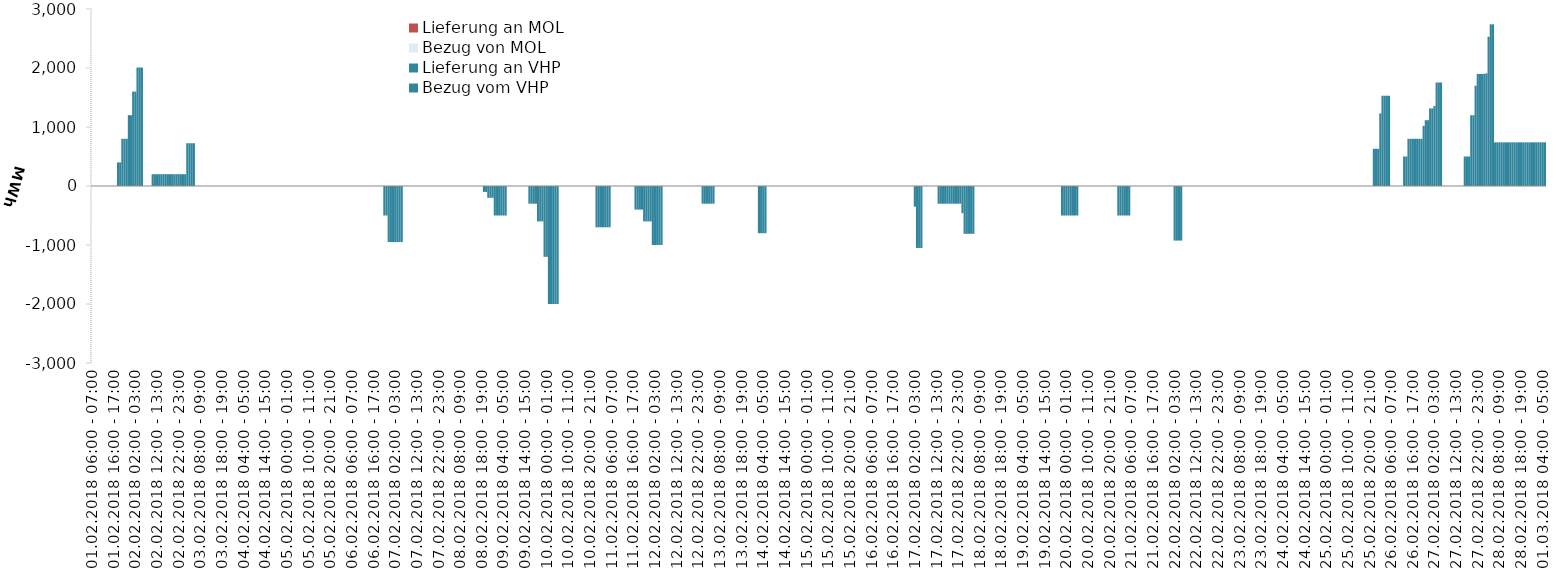
| Category | Bezug vom VHP | Lieferung an VHP | Bezug von MOL | Lieferung an MOL |
|---|---|---|---|---|
| 01.02.2018 06:00 - 07:00 | 0 | 0 | 0 | 0 |
| 01.02.2018 07:00 - 08:00 | 0 | 0 | 0 | 0 |
| 01.02.2018 08:00 - 09:00 | 0 | 0 | 0 | 0 |
| 01.02.2018 09:00 - 10:00 | 0 | 0 | 0 | 0 |
| 01.02.2018 10:00 - 11:00 | 0 | 0 | 0 | 0 |
| 01.02.2018 11:00 - 12:00 | 0 | 0 | 0 | 0 |
| 01.02.2018 12:00 - 13:00 | 0 | 0 | 0 | 0 |
| 01.02.2018 13:00 - 14:00 | 0 | 0 | 0 | 0 |
| 01.02.2018 14:00 - 15:00 | 0 | 0 | 0 | 0 |
| 01.02.2018 15:00 - 16:00 | 0 | 0 | 0 | 0 |
| 01.02.2018 16:00 - 17:00 | 0 | 0 | 0 | 0 |
| 01.02.2018 17:00 - 18:00 | 0 | 0 | 0 | 0 |
| 01.02.2018 18:00 - 19:00 | 400 | 0 | 0 | 0 |
| 01.02.2018 19:00 - 20:00 | 400 | 0 | 0 | 0 |
| 01.02.2018 20:00 - 21:00 | 800 | 0 | 0 | 0 |
| 01.02.2018 21:00 - 22:00 | 800 | 0 | 0 | 0 |
| 01.02.2018 22:00 - 23:00 | 800 | 0 | 0 | 0 |
| 01.02.2018 23:00 - 24:00 | 1200 | 0 | 0 | 0 |
| 02.02.2018 00:00 - 01:00 | 1200 | 0 | 0 | 0 |
| 02.02.2018 01:00 - 02:00 | 1600 | 0 | 0 | 0 |
| 02.02.2018 02:00 - 03:00 | 1600 | 0 | 0 | 0 |
| 02.02.2018 03:00 - 04:00 | 2008 | 0 | 0 | 0 |
| 02.02.2018 04:00 - 05:00 | 2008 | 0 | 0 | 0 |
| 02.02.2018 05:00 - 06:00 | 2008 | 0 | 0 | 0 |
| 02.02.2018 06:00 - 07:00 | 0 | 0 | 0 | 0 |
| 02.02.2018 07:00 - 08:00 | 0 | 0 | 0 | 0 |
| 02.02.2018 08:00 - 09:00 | 0 | 0 | 0 | 0 |
| 02.02.2018 09:00 - 10:00 | 0 | 0 | 0 | 0 |
| 02.02.2018 10:00 - 11:00 | 200 | 0 | 0 | 0 |
| 02.02.2018 11:00 - 12:00 | 200 | 0 | 0 | 0 |
| 02.02.2018 12:00 - 13:00 | 200 | 0 | 0 | 0 |
| 02.02.2018 13:00 - 14:00 | 200 | 0 | 0 | 0 |
| 02.02.2018 14:00 - 15:00 | 200 | 0 | 0 | 0 |
| 02.02.2018 15:00 - 16:00 | 200 | 0 | 0 | 0 |
| 02.02.2018 16:00 - 17:00 | 200 | 0 | 0 | 0 |
| 02.02.2018 17:00 - 18:00 | 200 | 0 | 0 | 0 |
| 02.02.2018 18:00 - 19:00 | 200 | 0 | 0 | 0 |
| 02.02.2018 19:00 - 20:00 | 200 | 0 | 0 | 0 |
| 02.02.2018 20:00 - 21:00 | 200 | 0 | 0 | 0 |
| 02.02.2018 21:00 - 22:00 | 200 | 0 | 0 | 0 |
| 02.02.2018 22:00 - 23:00 | 200 | 0 | 0 | 0 |
| 02.02.2018 23:00 - 24:00 | 200 | 0 | 0 | 0 |
| 03.02.2018 00:00 - 01:00 | 200 | 0 | 0 | 0 |
| 03.02.2018 01:00 - 02:00 | 200 | 0 | 0 | 0 |
| 03.02.2018 02:00 - 03:00 | 725 | 0 | 0 | 0 |
| 03.02.2018 03:00 - 04:00 | 725 | 0 | 0 | 0 |
| 03.02.2018 04:00 - 05:00 | 725 | 0 | 0 | 0 |
| 03.02.2018 05:00 - 06:00 | 725 | 0 | 0 | 0 |
| 03.02.2018 06:00 - 07:00 | 0 | 0 | 0 | 0 |
| 03.02.2018 07:00 - 08:00 | 0 | 0 | 0 | 0 |
| 03.02.2018 08:00 - 09:00 | 0 | 0 | 0 | 0 |
| 03.02.2018 09:00 - 10:00 | 0 | 0 | 0 | 0 |
| 03.02.2018 10:00 - 11:00 | 0 | 0 | 0 | 0 |
| 03.02.2018 11:00 - 12:00 | 0 | 0 | 0 | 0 |
| 03.02.2018 12:00 - 13:00 | 0 | 0 | 0 | 0 |
| 03.02.2018 13:00 - 14:00 | 0 | 0 | 0 | 0 |
| 03.02.2018 14:00 - 15:00 | 0 | 0 | 0 | 0 |
| 03.02.2018 15:00 - 16:00 | 0 | 0 | 0 | 0 |
| 03.02.2018 16:00 - 17:00 | 0 | 0 | 0 | 0 |
| 03.02.2018 17:00 - 18:00 | 0 | 0 | 0 | 0 |
| 03.02.2018 18:00 - 19:00 | 0 | 0 | 0 | 0 |
| 03.02.2018 19:00 - 20:00 | 0 | 0 | 0 | 0 |
| 03.02.2018 20:00 - 21:00 | 0 | 0 | 0 | 0 |
| 03.02.2018 21:00 - 22:00 | 0 | 0 | 0 | 0 |
| 03.02.2018 22:00 - 23:00 | 0 | 0 | 0 | 0 |
| 03.02.2018 23:00 - 24:00 | 0 | 0 | 0 | 0 |
| 04.02.2018 00:00 - 01:00 | 0 | 0 | 0 | 0 |
| 04.02.2018 01:00 - 02:00 | 0 | 0 | 0 | 0 |
| 04.02.2018 02:00 - 03:00 | 0 | 0 | 0 | 0 |
| 04.02.2018 03:00 - 04:00 | 0 | 0 | 0 | 0 |
| 04.02.2018 04:00 - 05:00 | 0 | 0 | 0 | 0 |
| 04.02.2018 05:00 - 06:00 | 0 | 0 | 0 | 0 |
| 04.02.2018 06:00 - 07:00 | 0 | 0 | 0 | 0 |
| 04.02.2018 07:00 - 08:00 | 0 | 0 | 0 | 0 |
| 04.02.2018 08:00 - 09:00 | 0 | 0 | 0 | 0 |
| 04.02.2018 09:00 - 10:00 | 0 | 0 | 0 | 0 |
| 04.02.2018 10:00 - 11:00 | 0 | 0 | 0 | 0 |
| 04.02.2018 11:00 - 12:00 | 0 | 0 | 0 | 0 |
| 04.02.2018 12:00 - 13:00 | 0 | 0 | 0 | 0 |
| 04.02.2018 13:00 - 14:00 | 0 | 0 | 0 | 0 |
| 04.02.2018 14:00 - 15:00 | 0 | 0 | 0 | 0 |
| 04.02.2018 15:00 - 16:00 | 0 | 0 | 0 | 0 |
| 04.02.2018 16:00 - 17:00 | 0 | 0 | 0 | 0 |
| 04.02.2018 17:00 - 18:00 | 0 | 0 | 0 | 0 |
| 04.02.2018 18:00 - 19:00 | 0 | 0 | 0 | 0 |
| 04.02.2018 19:00 - 20:00 | 0 | 0 | 0 | 0 |
| 04.02.2018 20:00 - 21:00 | 0 | 0 | 0 | 0 |
| 04.02.2018 21:00 - 22:00 | 0 | 0 | 0 | 0 |
| 04.02.2018 22:00 - 23:00 | 0 | 0 | 0 | 0 |
| 04.02.2018 23:00 - 24:00 | 0 | 0 | 0 | 0 |
| 05.02.2018 00:00 - 01:00 | 0 | 0 | 0 | 0 |
| 05.02.2018 01:00 - 02:00 | 0 | 0 | 0 | 0 |
| 05.02.2018 02:00 - 03:00 | 0 | 0 | 0 | 0 |
| 05.02.2018 03:00 - 04:00 | 0 | 0 | 0 | 0 |
| 05.02.2018 04:00 - 05:00 | 0 | 0 | 0 | 0 |
| 05.02.2018 05:00 - 06:00 | 0 | 0 | 0 | 0 |
| 05.02.2018 06:00 - 07:00 | 0 | 0 | 0 | 0 |
| 05.02.2018 07:00 - 08:00 | 0 | 0 | 0 | 0 |
| 05.02.2018 08:00 - 09:00 | 0 | 0 | 0 | 0 |
| 05.02.2018 09:00 - 10:00 | 0 | 0 | 0 | 0 |
| 05.02.2018 10:00 - 11:00 | 0 | 0 | 0 | 0 |
| 05.02.2018 11:00 - 12:00 | 0 | 0 | 0 | 0 |
| 05.02.2018 12:00 - 13:00 | 0 | 0 | 0 | 0 |
| 05.02.2018 13:00 - 14:00 | 0 | 0 | 0 | 0 |
| 05.02.2018 14:00 - 15:00 | 0 | 0 | 0 | 0 |
| 05.02.2018 15:00 - 16:00 | 0 | 0 | 0 | 0 |
| 05.02.2018 16:00 - 17:00 | 0 | 0 | 0 | 0 |
| 05.02.2018 17:00 - 18:00 | 0 | 0 | 0 | 0 |
| 05.02.2018 18:00 - 19:00 | 0 | 0 | 0 | 0 |
| 05.02.2018 19:00 - 20:00 | 0 | 0 | 0 | 0 |
| 05.02.2018 20:00 - 21:00 | 0 | 0 | 0 | 0 |
| 05.02.2018 21:00 - 22:00 | 0 | 0 | 0 | 0 |
| 05.02.2018 22:00 - 23:00 | 0 | 0 | 0 | 0 |
| 05.02.2018 23:00 - 24:00 | 0 | 0 | 0 | 0 |
| 06.02.2018 00:00 - 01:00 | 0 | 0 | 0 | 0 |
| 06.02.2018 01:00 - 02:00 | 0 | 0 | 0 | 0 |
| 06.02.2018 02:00 - 03:00 | 0 | 0 | 0 | 0 |
| 06.02.2018 03:00 - 04:00 | 0 | 0 | 0 | 0 |
| 06.02.2018 04:00 - 05:00 | 0 | 0 | 0 | 0 |
| 06.02.2018 05:00 - 06:00 | 0 | 0 | 0 | 0 |
| 06.02.2018 06:00 - 07:00 | 0 | 0 | 0 | 0 |
| 06.02.2018 07:00 - 08:00 | 0 | 0 | 0 | 0 |
| 06.02.2018 08:00 - 09:00 | 0 | 0 | 0 | 0 |
| 06.02.2018 09:00 - 10:00 | 0 | 0 | 0 | 0 |
| 06.02.2018 10:00 - 11:00 | 0 | 0 | 0 | 0 |
| 06.02.2018 11:00 - 12:00 | 0 | 0 | 0 | 0 |
| 06.02.2018 12:00 - 13:00 | 0 | 0 | 0 | 0 |
| 06.02.2018 13:00 - 14:00 | 0 | 0 | 0 | 0 |
| 06.02.2018 14:00 - 15:00 | 0 | 0 | 0 | 0 |
| 06.02.2018 15:00 - 16:00 | 0 | 0 | 0 | 0 |
| 06.02.2018 16:00 - 17:00 | 0 | 0 | 0 | 0 |
| 06.02.2018 17:00 - 18:00 | 0 | 0 | 0 | 0 |
| 06.02.2018 18:00 - 19:00 | 0 | 0 | 0 | 0 |
| 06.02.2018 19:00 - 20:00 | 0 | 0 | 0 | 0 |
| 06.02.2018 20:00 - 21:00 | 0 | 0 | 0 | 0 |
| 06.02.2018 21:00 - 22:00 | 0 | -500 | 0 | 0 |
| 06.02.2018 22:00 - 23:00 | 0 | -500 | 0 | 0 |
| 06.02.2018 23:00 - 24:00 | 0 | -950 | 0 | 0 |
| 07.02.2018 00:00 - 01:00 | 0 | -950 | 0 | 0 |
| 07.02.2018 01:00 - 02:00 | 0 | -950 | 0 | 0 |
| 07.02.2018 02:00 - 03:00 | 0 | -950 | 0 | 0 |
| 07.02.2018 03:00 - 04:00 | 0 | -950 | 0 | 0 |
| 07.02.2018 04:00 - 05:00 | 0 | -950 | 0 | 0 |
| 07.02.2018 05:00 - 06:00 | 0 | -950 | 0 | 0 |
| 07.02.2018 06:00 - 07:00 | 0 | 0 | 0 | 0 |
| 07.02.2018 07:00 - 08:00 | 0 | 0 | 0 | 0 |
| 07.02.2018 08:00 - 09:00 | 0 | 0 | 0 | 0 |
| 07.02.2018 09:00 - 10:00 | 0 | 0 | 0 | 0 |
| 07.02.2018 10:00 - 11:00 | 0 | 0 | 0 | 0 |
| 07.02.2018 11:00 - 12:00 | 0 | 0 | 0 | 0 |
| 07.02.2018 12:00 - 13:00 | 0 | 0 | 0 | 0 |
| 07.02.2018 13:00 - 14:00 | 0 | 0 | 0 | 0 |
| 07.02.2018 14:00 - 15:00 | 0 | 0 | 0 | 0 |
| 07.02.2018 15:00 - 16:00 | 0 | 0 | 0 | 0 |
| 07.02.2018 16:00 - 17:00 | 0 | 0 | 0 | 0 |
| 07.02.2018 17:00 - 18:00 | 0 | 0 | 0 | 0 |
| 07.02.2018 18:00 - 19:00 | 0 | 0 | 0 | 0 |
| 07.02.2018 19:00 - 20:00 | 0 | 0 | 0 | 0 |
| 07.02.2018 20:00 - 21:00 | 0 | 0 | 0 | 0 |
| 07.02.2018 21:00 - 22:00 | 0 | 0 | 0 | 0 |
| 07.02.2018 22:00 - 23:00 | 0 | 0 | 0 | 0 |
| 07.02.2018 23:00 - 24:00 | 0 | 0 | 0 | 0 |
| 08.02.2018 00:00 - 01:00 | 0 | 0 | 0 | 0 |
| 08.02.2018 01:00 - 02:00 | 0 | 0 | 0 | 0 |
| 08.02.2018 02:00 - 03:00 | 0 | 0 | 0 | 0 |
| 08.02.2018 03:00 - 04:00 | 0 | 0 | 0 | 0 |
| 08.02.2018 04:00 - 05:00 | 0 | 0 | 0 | 0 |
| 08.02.2018 05:00 - 06:00 | 0 | 0 | 0 | 0 |
| 08.02.2018 06:00 - 07:00 | 0 | 0 | 0 | 0 |
| 08.02.2018 07:00 - 08:00 | 0 | 0 | 0 | 0 |
| 08.02.2018 08:00 - 09:00 | 0 | 0 | 0 | 0 |
| 08.02.2018 09:00 - 10:00 | 0 | 0 | 0 | 0 |
| 08.02.2018 10:00 - 11:00 | 0 | 0 | 0 | 0 |
| 08.02.2018 11:00 - 12:00 | 0 | 0 | 0 | 0 |
| 08.02.2018 12:00 - 13:00 | 0 | 0 | 0 | 0 |
| 08.02.2018 13:00 - 14:00 | 0 | 0 | 0 | 0 |
| 08.02.2018 14:00 - 15:00 | 0 | 0 | 0 | 0 |
| 08.02.2018 15:00 - 16:00 | 0 | 0 | 0 | 0 |
| 08.02.2018 16:00 - 17:00 | 0 | 0 | 0 | 0 |
| 08.02.2018 17:00 - 18:00 | 0 | 0 | 0 | 0 |
| 08.02.2018 18:00 - 19:00 | 0 | 0 | 0 | 0 |
| 08.02.2018 19:00 - 20:00 | 0 | -100 | 0 | 0 |
| 08.02.2018 20:00 - 21:00 | 0 | -100 | 0 | 0 |
| 08.02.2018 21:00 - 22:00 | 0 | -200 | 0 | 0 |
| 08.02.2018 22:00 - 23:00 | 0 | -200 | 0 | 0 |
| 08.02.2018 23:00 - 24:00 | 0 | -200 | 0 | 0 |
| 09.02.2018 00:00 - 01:00 | 0 | -500 | 0 | 0 |
| 09.02.2018 01:00 - 02:00 | 0 | -500 | 0 | 0 |
| 09.02.2018 02:00 - 03:00 | 0 | -500 | 0 | 0 |
| 09.02.2018 03:00 - 04:00 | 0 | -500 | 0 | 0 |
| 09.02.2018 04:00 - 05:00 | 0 | -500 | 0 | 0 |
| 09.02.2018 05:00 - 06:00 | 0 | -500 | 0 | 0 |
| 09.02.2018 06:00 - 07:00 | 0 | 0 | 0 | 0 |
| 09.02.2018 07:00 - 08:00 | 0 | 0 | 0 | 0 |
| 09.02.2018 08:00 - 09:00 | 0 | 0 | 0 | 0 |
| 09.02.2018 09:00 - 10:00 | 0 | 0 | 0 | 0 |
| 09.02.2018 10:00 - 11:00 | 0 | 0 | 0 | 0 |
| 09.02.2018 11:00 - 12:00 | 0 | 0 | 0 | 0 |
| 09.02.2018 12:00 - 13:00 | 0 | 0 | 0 | 0 |
| 09.02.2018 13:00 - 14:00 | 0 | 0 | 0 | 0 |
| 09.02.2018 14:00 - 15:00 | 0 | 0 | 0 | 0 |
| 09.02.2018 15:00 - 16:00 | 0 | 0 | 0 | 0 |
| 09.02.2018 16:00 - 17:00 | 0 | -300 | 0 | 0 |
| 09.02.2018 17:00 - 18:00 | 0 | -300 | 0 | 0 |
| 09.02.2018 18:00 - 19:00 | 0 | -300 | 0 | 0 |
| 09.02.2018 19:00 - 20:00 | 0 | -300 | 0 | 0 |
| 09.02.2018 20:00 - 21:00 | 0 | -600 | 0 | 0 |
| 09.02.2018 21:00 - 22:00 | 0 | -600 | 0 | 0 |
| 09.02.2018 22:00 - 23:00 | 0 | -600 | 0 | 0 |
| 09.02.2018 23:00 - 24:00 | 0 | -1200 | 0 | 0 |
| 10.02.2018 00:00 - 01:00 | 0 | -1200 | 0 | 0 |
| 10.02.2018 01:00 - 02:00 | 0 | -2000 | 0 | 0 |
| 10.02.2018 02:00 - 03:00 | 0 | -2000 | 0 | 0 |
| 10.02.2018 03:00 - 04:00 | 0 | -2000 | 0 | 0 |
| 10.02.2018 04:00 - 05:00 | 0 | -2000 | 0 | 0 |
| 10.02.2018 05:00 - 06:00 | 0 | -2000 | 0 | 0 |
| 10.02.2018 06:00 - 07:00 | 0 | 0 | 0 | 0 |
| 10.02.2018 07:00 - 08:00 | 0 | 0 | 0 | 0 |
| 10.02.2018 08:00 - 09:00 | 0 | 0 | 0 | 0 |
| 10.02.2018 09:00 - 10:00 | 0 | 0 | 0 | 0 |
| 10.02.2018 10:00 - 11:00 | 0 | 0 | 0 | 0 |
| 10.02.2018 11:00 - 12:00 | 0 | 0 | 0 | 0 |
| 10.02.2018 12:00 - 13:00 | 0 | 0 | 0 | 0 |
| 10.02.2018 13:00 - 14:00 | 0 | 0 | 0 | 0 |
| 10.02.2018 14:00 - 15:00 | 0 | 0 | 0 | 0 |
| 10.02.2018 15:00 - 16:00 | 0 | 0 | 0 | 0 |
| 10.02.2018 16:00 - 17:00 | 0 | 0 | 0 | 0 |
| 10.02.2018 17:00 - 18:00 | 0 | 0 | 0 | 0 |
| 10.02.2018 18:00 - 19:00 | 0 | 0 | 0 | 0 |
| 10.02.2018 19:00 - 20:00 | 0 | 0 | 0 | 0 |
| 10.02.2018 20:00 - 21:00 | 0 | 0 | 0 | 0 |
| 10.02.2018 21:00 - 22:00 | 0 | 0 | 0 | 0 |
| 10.02.2018 22:00 - 23:00 | 0 | 0 | 0 | 0 |
| 10.02.2018 23:00 - 24:00 | 0 | -700 | 0 | 0 |
| 11.02.2018 00:00 - 01:00 | 0 | -700 | 0 | 0 |
| 11.02.2018 01:00 - 02:00 | 0 | -700 | 0 | 0 |
| 11.02.2018 02:00 - 03:00 | 0 | -700 | 0 | 0 |
| 11.02.2018 03:00 - 04:00 | 0 | -700 | 0 | 0 |
| 11.02.2018 04:00 - 05:00 | 0 | -700 | 0 | 0 |
| 11.02.2018 05:00 - 06:00 | 0 | -700 | 0 | 0 |
| 11.02.2018 06:00 - 07:00 | 0 | 0 | 0 | 0 |
| 11.02.2018 07:00 - 08:00 | 0 | 0 | 0 | 0 |
| 11.02.2018 08:00 - 09:00 | 0 | 0 | 0 | 0 |
| 11.02.2018 09:00 - 10:00 | 0 | 0 | 0 | 0 |
| 11.02.2018 10:00 - 11:00 | 0 | 0 | 0 | 0 |
| 11.02.2018 11:00 - 12:00 | 0 | 0 | 0 | 0 |
| 11.02.2018 12:00 - 13:00 | 0 | 0 | 0 | 0 |
| 11.02.2018 13:00 - 14:00 | 0 | 0 | 0 | 0 |
| 11.02.2018 14:00 - 15:00 | 0 | 0 | 0 | 0 |
| 11.02.2018 15:00 - 16:00 | 0 | 0 | 0 | 0 |
| 11.02.2018 16:00 - 17:00 | 0 | 0 | 0 | 0 |
| 11.02.2018 17:00 - 18:00 | 0 | -400 | 0 | 0 |
| 11.02.2018 18:00 - 19:00 | 0 | -400 | 0 | 0 |
| 11.02.2018 19:00 - 20:00 | 0 | -400 | 0 | 0 |
| 11.02.2018 20:00 - 21:00 | 0 | -400 | 0 | 0 |
| 11.02.2018 21:00 - 22:00 | 0 | -600 | 0 | 0 |
| 11.02.2018 22:00 - 23:00 | 0 | -600 | 0 | 0 |
| 11.02.2018 23:00 - 24:00 | 0 | -600 | 0 | 0 |
| 12.02.2018 00:00 - 01:00 | 0 | -600 | 0 | 0 |
| 12.02.2018 01:00 - 02:00 | 0 | -1000 | 0 | 0 |
| 12.02.2018 02:00 - 03:00 | 0 | -1000 | 0 | 0 |
| 12.02.2018 03:00 - 04:00 | 0 | -1000 | 0 | 0 |
| 12.02.2018 04:00 - 05:00 | 0 | -1000 | 0 | 0 |
| 12.02.2018 05:00 - 06:00 | 0 | -1000 | 0 | 0 |
| 12.02.2018 06:00 - 07:00 | 0 | 0 | 0 | 0 |
| 12.02.2018 07:00 - 08:00 | 0 | 0 | 0 | 0 |
| 12.02.2018 08:00 - 09:00 | 0 | 0 | 0 | 0 |
| 12.02.2018 09:00 - 10:00 | 0 | 0 | 0 | 0 |
| 12.02.2018 10:00 - 11:00 | 0 | 0 | 0 | 0 |
| 12.02.2018 11:00 - 12:00 | 0 | 0 | 0 | 0 |
| 12.02.2018 12:00 - 13:00 | 0 | 0 | 0 | 0 |
| 12.02.2018 13:00 - 14:00 | 0 | 0 | 0 | 0 |
| 12.02.2018 14:00 - 15:00 | 0 | 0 | 0 | 0 |
| 12.02.2018 15:00 - 16:00 | 0 | 0 | 0 | 0 |
| 12.02.2018 16:00 - 17:00 | 0 | 0 | 0 | 0 |
| 12.02.2018 17:00 - 18:00 | 0 | 0 | 0 | 0 |
| 12.02.2018 18:00 - 19:00 | 0 | 0 | 0 | 0 |
| 12.02.2018 19:00 - 20:00 | 0 | 0 | 0 | 0 |
| 12.02.2018 20:00 - 21:00 | 0 | 0 | 0 | 0 |
| 12.02.2018 21:00 - 22:00 | 0 | 0 | 0 | 0 |
| 12.02.2018 22:00 - 23:00 | 0 | 0 | 0 | 0 |
| 12.02.2018 23:00 - 24:00 | 0 | 0 | 0 | 0 |
| 13.02.2018 00:00 - 01:00 | 0 | -300 | 0 | 0 |
| 13.02.2018 01:00 - 02:00 | 0 | -300 | 0 | 0 |
| 13.02.2018 02:00 - 03:00 | 0 | -300 | 0 | 0 |
| 13.02.2018 03:00 - 04:00 | 0 | -300 | 0 | 0 |
| 13.02.2018 04:00 - 05:00 | 0 | -300 | 0 | 0 |
| 13.02.2018 05:00 - 06:00 | 0 | -300 | 0 | 0 |
| 13.02.2018 06:00 - 07:00 | 0 | 0 | 0 | 0 |
| 13.02.2018 07:00 - 08:00 | 0 | 0 | 0 | 0 |
| 13.02.2018 08:00 - 09:00 | 0 | 0 | 0 | 0 |
| 13.02.2018 09:00 - 10:00 | 0 | 0 | 0 | 0 |
| 13.02.2018 10:00 - 11:00 | 0 | 0 | 0 | 0 |
| 13.02.2018 11:00 - 12:00 | 0 | 0 | 0 | 0 |
| 13.02.2018 12:00 - 13:00 | 0 | 0 | 0 | 0 |
| 13.02.2018 13:00 - 14:00 | 0 | 0 | 0 | 0 |
| 13.02.2018 14:00 - 15:00 | 0 | 0 | 0 | 0 |
| 13.02.2018 15:00 - 16:00 | 0 | 0 | 0 | 0 |
| 13.02.2018 16:00 - 17:00 | 0 | 0 | 0 | 0 |
| 13.02.2018 17:00 - 18:00 | 0 | 0 | 0 | 0 |
| 13.02.2018 18:00 - 19:00 | 0 | 0 | 0 | 0 |
| 13.02.2018 19:00 - 20:00 | 0 | 0 | 0 | 0 |
| 13.02.2018 20:00 - 21:00 | 0 | 0 | 0 | 0 |
| 13.02.2018 21:00 - 22:00 | 0 | 0 | 0 | 0 |
| 13.02.2018 22:00 - 23:00 | 0 | 0 | 0 | 0 |
| 13.02.2018 23:00 - 24:00 | 0 | 0 | 0 | 0 |
| 14.02.2018 00:00 - 01:00 | 0 | 0 | 0 | 0 |
| 14.02.2018 01:00 - 02:00 | 0 | 0 | 0 | 0 |
| 14.02.2018 02:00 - 03:00 | 0 | -800 | 0 | 0 |
| 14.02.2018 03:00 - 04:00 | 0 | -800 | 0 | 0 |
| 14.02.2018 04:00 - 05:00 | 0 | -800 | 0 | 0 |
| 14.02.2018 05:00 - 06:00 | 0 | -800 | 0 | 0 |
| 14.02.2018 06:00 - 07:00 | 0 | 0 | 0 | 0 |
| 14.02.2018 07:00 - 08:00 | 0 | 0 | 0 | 0 |
| 14.02.2018 08:00 - 09:00 | 0 | 0 | 0 | 0 |
| 14.02.2018 09:00 - 10:00 | 0 | 0 | 0 | 0 |
| 14.02.2018 10:00 - 11:00 | 0 | 0 | 0 | 0 |
| 14.02.2018 11:00 - 12:00 | 0 | 0 | 0 | 0 |
| 14.02.2018 12:00 - 13:00 | 0 | 0 | 0 | 0 |
| 14.02.2018 13:00 - 14:00 | 0 | 0 | 0 | 0 |
| 14.02.2018 14:00 - 15:00 | 0 | 0 | 0 | 0 |
| 14.02.2018 15:00 - 16:00 | 0 | 0 | 0 | 0 |
| 14.02.2018 16:00 - 17:00 | 0 | 0 | 0 | 0 |
| 14.02.2018 17:00 - 18:00 | 0 | 0 | 0 | 0 |
| 14.02.2018 18:00 - 19:00 | 0 | 0 | 0 | 0 |
| 14.02.2018 19:00 - 20:00 | 0 | 0 | 0 | 0 |
| 14.02.2018 20:00 - 21:00 | 0 | 0 | 0 | 0 |
| 14.02.2018 21:00 - 22:00 | 0 | 0 | 0 | 0 |
| 14.02.2018 22:00 - 23:00 | 0 | 0 | 0 | 0 |
| 14.02.2018 23:00 - 24:00 | 0 | 0 | 0 | 0 |
| 15.02.2018 00:00 - 01:00 | 0 | 0 | 0 | 0 |
| 15.02.2018 01:00 - 02:00 | 0 | 0 | 0 | 0 |
| 15.02.2018 02:00 - 03:00 | 0 | 0 | 0 | 0 |
| 15.02.2018 03:00 - 04:00 | 0 | 0 | 0 | 0 |
| 15.02.2018 04:00 - 05:00 | 0 | 0 | 0 | 0 |
| 15.02.2018 05:00 - 06:00 | 0 | 0 | 0 | 0 |
| 15.02.2018 06:00 - 07:00 | 0 | 0 | 0 | 0 |
| 15.02.2018 07:00 - 08:00 | 0 | 0 | 0 | 0 |
| 15.02.2018 08:00 - 09:00 | 0 | 0 | 0 | 0 |
| 15.02.2018 09:00 - 10:00 | 0 | 0 | 0 | 0 |
| 15.02.2018 10:00 - 11:00 | 0 | 0 | 0 | 0 |
| 15.02.2018 11:00 - 12:00 | 0 | 0 | 0 | 0 |
| 15.02.2018 12:00 - 13:00 | 0 | 0 | 0 | 0 |
| 15.02.2018 13:00 - 14:00 | 0 | 0 | 0 | 0 |
| 15.02.2018 14:00 - 15:00 | 0 | 0 | 0 | 0 |
| 15.02.2018 15:00 - 16:00 | 0 | 0 | 0 | 0 |
| 15.02.2018 16:00 - 17:00 | 0 | 0 | 0 | 0 |
| 15.02.2018 17:00 - 18:00 | 0 | 0 | 0 | 0 |
| 15.02.2018 18:00 - 19:00 | 0 | 0 | 0 | 0 |
| 15.02.2018 19:00 - 20:00 | 0 | 0 | 0 | 0 |
| 15.02.2018 20:00 - 21:00 | 0 | 0 | 0 | 0 |
| 15.02.2018 21:00 - 22:00 | 0 | 0 | 0 | 0 |
| 15.02.2018 22:00 - 23:00 | 0 | 0 | 0 | 0 |
| 15.02.2018 23:00 - 24:00 | 0 | 0 | 0 | 0 |
| 16.02.2018 00:00 - 01:00 | 0 | 0 | 0 | 0 |
| 16.02.2018 01:00 - 02:00 | 0 | 0 | 0 | 0 |
| 16.02.2018 02:00 - 03:00 | 0 | 0 | 0 | 0 |
| 16.02.2018 03:00 - 04:00 | 0 | 0 | 0 | 0 |
| 16.02.2018 04:00 - 05:00 | 0 | 0 | 0 | 0 |
| 16.02.2018 05:00 - 06:00 | 0 | 0 | 0 | 0 |
| 16.02.2018 06:00 - 07:00 | 0 | 0 | 0 | 0 |
| 16.02.2018 07:00 - 08:00 | 0 | 0 | 0 | 0 |
| 16.02.2018 08:00 - 09:00 | 0 | 0 | 0 | 0 |
| 16.02.2018 09:00 - 10:00 | 0 | 0 | 0 | 0 |
| 16.02.2018 10:00 - 11:00 | 0 | 0 | 0 | 0 |
| 16.02.2018 11:00 - 12:00 | 0 | 0 | 0 | 0 |
| 16.02.2018 12:00 - 13:00 | 0 | 0 | 0 | 0 |
| 16.02.2018 13:00 - 14:00 | 0 | 0 | 0 | 0 |
| 16.02.2018 14:00 - 15:00 | 0 | 0 | 0 | 0 |
| 16.02.2018 15:00 - 16:00 | 0 | 0 | 0 | 0 |
| 16.02.2018 16:00 - 17:00 | 0 | 0 | 0 | 0 |
| 16.02.2018 17:00 - 18:00 | 0 | 0 | 0 | 0 |
| 16.02.2018 18:00 - 19:00 | 0 | 0 | 0 | 0 |
| 16.02.2018 19:00 - 20:00 | 0 | 0 | 0 | 0 |
| 16.02.2018 20:00 - 21:00 | 0 | 0 | 0 | 0 |
| 16.02.2018 21:00 - 22:00 | 0 | 0 | 0 | 0 |
| 16.02.2018 22:00 - 23:00 | 0 | 0 | 0 | 0 |
| 16.02.2018 23:00 - 24:00 | 0 | 0 | 0 | 0 |
| 17.02.2018 00:00 - 01:00 | 0 | 0 | 0 | 0 |
| 17.02.2018 01:00 - 02:00 | 0 | 0 | 0 | 0 |
| 17.02.2018 02:00 - 03:00 | 0 | -350 | 0 | 0 |
| 17.02.2018 03:00 - 04:00 | 0 | -1050 | 0 | 0 |
| 17.02.2018 04:00 - 05:00 | 0 | -1050 | 0 | 0 |
| 17.02.2018 05:00 - 06:00 | 0 | -1050 | 0 | 0 |
| 17.02.2018 06:00 - 07:00 | 0 | 0 | 0 | 0 |
| 17.02.2018 07:00 - 08:00 | 0 | 0 | 0 | 0 |
| 17.02.2018 08:00 - 09:00 | 0 | 0 | 0 | 0 |
| 17.02.2018 09:00 - 10:00 | 0 | 0 | 0 | 0 |
| 17.02.2018 10:00 - 11:00 | 0 | 0 | 0 | 0 |
| 17.02.2018 11:00 - 12:00 | 0 | 0 | 0 | 0 |
| 17.02.2018 12:00 - 13:00 | 0 | 0 | 0 | 0 |
| 17.02.2018 13:00 - 14:00 | 0 | -300 | 0 | 0 |
| 17.02.2018 14:00 - 15:00 | 0 | -300 | 0 | 0 |
| 17.02.2018 15:00 - 16:00 | 0 | -300 | 0 | 0 |
| 17.02.2018 16:00 - 17:00 | 0 | -300 | 0 | 0 |
| 17.02.2018 17:00 - 18:00 | 0 | -300 | 0 | 0 |
| 17.02.2018 18:00 - 19:00 | 0 | -300 | 0 | 0 |
| 17.02.2018 19:00 - 20:00 | 0 | -300 | 0 | 0 |
| 17.02.2018 20:00 - 21:00 | 0 | -300 | 0 | 0 |
| 17.02.2018 21:00 - 22:00 | 0 | -300 | 0 | 0 |
| 17.02.2018 22:00 - 23:00 | 0 | -300 | 0 | 0 |
| 17.02.2018 23:00 - 24:00 | 0 | -300 | 0 | 0 |
| 18.02.2018 00:00 - 01:00 | 0 | -460 | 0 | 0 |
| 18.02.2018 01:00 - 02:00 | 0 | -810 | 0 | 0 |
| 18.02.2018 02:00 - 03:00 | 0 | -810 | 0 | 0 |
| 18.02.2018 03:00 - 04:00 | 0 | -810 | 0 | 0 |
| 18.02.2018 04:00 - 05:00 | 0 | -810 | 0 | 0 |
| 18.02.2018 05:00 - 06:00 | 0 | -810 | 0 | 0 |
| 18.02.2018 06:00 - 07:00 | 0 | 0 | 0 | 0 |
| 18.02.2018 07:00 - 08:00 | 0 | 0 | 0 | 0 |
| 18.02.2018 08:00 - 09:00 | 0 | 0 | 0 | 0 |
| 18.02.2018 09:00 - 10:00 | 0 | 0 | 0 | 0 |
| 18.02.2018 10:00 - 11:00 | 0 | 0 | 0 | 0 |
| 18.02.2018 11:00 - 12:00 | 0 | 0 | 0 | 0 |
| 18.02.2018 12:00 - 13:00 | 0 | 0 | 0 | 0 |
| 18.02.2018 13:00 - 14:00 | 0 | 0 | 0 | 0 |
| 18.02.2018 14:00 - 15:00 | 0 | 0 | 0 | 0 |
| 18.02.2018 15:00 - 16:00 | 0 | 0 | 0 | 0 |
| 18.02.2018 16:00 - 17:00 | 0 | 0 | 0 | 0 |
| 18.02.2018 17:00 - 18:00 | 0 | 0 | 0 | 0 |
| 18.02.2018 18:00 - 19:00 | 0 | 0 | 0 | 0 |
| 18.02.2018 19:00 - 20:00 | 0 | 0 | 0 | 0 |
| 18.02.2018 20:00 - 21:00 | 0 | 0 | 0 | 0 |
| 18.02.2018 21:00 - 22:00 | 0 | 0 | 0 | 0 |
| 18.02.2018 22:00 - 23:00 | 0 | 0 | 0 | 0 |
| 18.02.2018 23:00 - 24:00 | 0 | 0 | 0 | 0 |
| 19.02.2018 00:00 - 01:00 | 0 | 0 | 0 | 0 |
| 19.02.2018 01:00 - 02:00 | 0 | 0 | 0 | 0 |
| 19.02.2018 02:00 - 03:00 | 0 | 0 | 0 | 0 |
| 19.02.2018 03:00 - 04:00 | 0 | 0 | 0 | 0 |
| 19.02.2018 04:00 - 05:00 | 0 | 0 | 0 | 0 |
| 19.02.2018 05:00 - 06:00 | 0 | 0 | 0 | 0 |
| 19.02.2018 06:00 - 07:00 | 0 | 0 | 0 | 0 |
| 19.02.2018 07:00 - 08:00 | 0 | 0 | 0 | 0 |
| 19.02.2018 08:00 - 09:00 | 0 | 0 | 0 | 0 |
| 19.02.2018 09:00 - 10:00 | 0 | 0 | 0 | 0 |
| 19.02.2018 10:00 - 11:00 | 0 | 0 | 0 | 0 |
| 19.02.2018 11:00 - 12:00 | 0 | 0 | 0 | 0 |
| 19.02.2018 12:00 - 13:00 | 0 | 0 | 0 | 0 |
| 19.02.2018 13:00 - 14:00 | 0 | 0 | 0 | 0 |
| 19.02.2018 14:00 - 15:00 | 0 | 0 | 0 | 0 |
| 19.02.2018 15:00 - 16:00 | 0 | 0 | 0 | 0 |
| 19.02.2018 16:00 - 17:00 | 0 | 0 | 0 | 0 |
| 19.02.2018 17:00 - 18:00 | 0 | 0 | 0 | 0 |
| 19.02.2018 18:00 - 19:00 | 0 | 0 | 0 | 0 |
| 19.02.2018 19:00 - 20:00 | 0 | 0 | 0 | 0 |
| 19.02.2018 20:00 - 21:00 | 0 | 0 | 0 | 0 |
| 19.02.2018 21:00 - 22:00 | 0 | 0 | 0 | 0 |
| 19.02.2018 22:00 - 23:00 | 0 | -500 | 0 | 0 |
| 19.02.2018 23:00 - 24:00 | 0 | -500 | 0 | 0 |
| 20.02.2018 00:00 - 01:00 | 0 | -500 | 0 | 0 |
| 20.02.2018 01:00 - 02:00 | 0 | -500 | 0 | 0 |
| 20.02.2018 02:00 - 03:00 | 0 | -500 | 0 | 0 |
| 20.02.2018 03:00 - 04:00 | 0 | -500 | 0 | 0 |
| 20.02.2018 04:00 - 05:00 | 0 | -500 | 0 | 0 |
| 20.02.2018 05:00 - 06:00 | 0 | -500 | 0 | 0 |
| 20.02.2018 06:00 - 07:00 | 0 | 0 | 0 | 0 |
| 20.02.2018 07:00 - 08:00 | 0 | 0 | 0 | 0 |
| 20.02.2018 08:00 - 09:00 | 0 | 0 | 0 | 0 |
| 20.02.2018 09:00 - 10:00 | 0 | 0 | 0 | 0 |
| 20.02.2018 10:00 - 11:00 | 0 | 0 | 0 | 0 |
| 20.02.2018 11:00 - 12:00 | 0 | 0 | 0 | 0 |
| 20.02.2018 12:00 - 13:00 | 0 | 0 | 0 | 0 |
| 20.02.2018 13:00 - 14:00 | 0 | 0 | 0 | 0 |
| 20.02.2018 14:00 - 15:00 | 0 | 0 | 0 | 0 |
| 20.02.2018 15:00 - 16:00 | 0 | 0 | 0 | 0 |
| 20.02.2018 16:00 - 17:00 | 0 | 0 | 0 | 0 |
| 20.02.2018 17:00 - 18:00 | 0 | 0 | 0 | 0 |
| 20.02.2018 18:00 - 19:00 | 0 | 0 | 0 | 0 |
| 20.02.2018 19:00 - 20:00 | 0 | 0 | 0 | 0 |
| 20.02.2018 20:00 - 21:00 | 0 | 0 | 0 | 0 |
| 20.02.2018 21:00 - 22:00 | 0 | 0 | 0 | 0 |
| 20.02.2018 22:00 - 23:00 | 0 | 0 | 0 | 0 |
| 20.02.2018 23:00 - 24:00 | 0 | 0 | 0 | 0 |
| 21.02.2018 00:00 - 01:00 | 0 | -500 | 0 | 0 |
| 21.02.2018 01:00 - 02:00 | 0 | -500 | 0 | 0 |
| 21.02.2018 02:00 - 03:00 | 0 | -500 | 0 | 0 |
| 21.02.2018 03:00 - 04:00 | 0 | -500 | 0 | 0 |
| 21.02.2018 04:00 - 05:00 | 0 | -500 | 0 | 0 |
| 21.02.2018 05:00 - 06:00 | 0 | -500 | 0 | 0 |
| 21.02.2018 06:00 - 07:00 | 0 | 0 | 0 | 0 |
| 21.02.2018 07:00 - 08:00 | 0 | 0 | 0 | 0 |
| 21.02.2018 08:00 - 09:00 | 0 | 0 | 0 | 0 |
| 21.02.2018 09:00 - 10:00 | 0 | 0 | 0 | 0 |
| 21.02.2018 10:00 - 11:00 | 0 | 0 | 0 | 0 |
| 21.02.2018 11:00 - 12:00 | 0 | 0 | 0 | 0 |
| 21.02.2018 12:00 - 13:00 | 0 | 0 | 0 | 0 |
| 21.02.2018 13:00 - 14:00 | 0 | 0 | 0 | 0 |
| 21.02.2018 14:00 - 15:00 | 0 | 0 | 0 | 0 |
| 21.02.2018 15:00 - 16:00 | 0 | 0 | 0 | 0 |
| 21.02.2018 16:00 - 17:00 | 0 | 0 | 0 | 0 |
| 21.02.2018 17:00 - 18:00 | 0 | 0 | 0 | 0 |
| 21.02.2018 18:00 - 19:00 | 0 | 0 | 0 | 0 |
| 21.02.2018 19:00 - 20:00 | 0 | 0 | 0 | 0 |
| 21.02.2018 20:00 - 21:00 | 0 | 0 | 0 | 0 |
| 21.02.2018 21:00 - 22:00 | 0 | 0 | 0 | 0 |
| 21.02.2018 22:00 - 23:00 | 0 | 0 | 0 | 0 |
| 21.02.2018 23:00 - 24:00 | 0 | 0 | 0 | 0 |
| 22.02.2018 00:00 - 01:00 | 0 | 0 | 0 | 0 |
| 22.02.2018 01:00 - 02:00 | 0 | 0 | 0 | 0 |
| 22.02.2018 02:00 - 03:00 | 0 | -925 | 0 | 0 |
| 22.02.2018 03:00 - 04:00 | 0 | -925 | 0 | 0 |
| 22.02.2018 04:00 - 05:00 | 0 | -925 | 0 | 0 |
| 22.02.2018 05:00 - 06:00 | 0 | -925 | 0 | 0 |
| 22.02.2018 06:00 - 07:00 | 0 | 0 | 0 | 0 |
| 22.02.2018 07:00 - 08:00 | 0 | 0 | 0 | 0 |
| 22.02.2018 08:00 - 09:00 | 0 | 0 | 0 | 0 |
| 22.02.2018 09:00 - 10:00 | 0 | 0 | 0 | 0 |
| 22.02.2018 10:00 - 11:00 | 0 | 0 | 0 | 0 |
| 22.02.2018 11:00 - 12:00 | 0 | 0 | 0 | 0 |
| 22.02.2018 12:00 - 13:00 | 0 | 0 | 0 | 0 |
| 22.02.2018 13:00 - 14:00 | 0 | 0 | 0 | 0 |
| 22.02.2018 14:00 - 15:00 | 0 | 0 | 0 | 0 |
| 22.02.2018 15:00 - 16:00 | 0 | 0 | 0 | 0 |
| 22.02.2018 16:00 - 17:00 | 0 | 0 | 0 | 0 |
| 22.02.2018 17:00 - 18:00 | 0 | 0 | 0 | 0 |
| 22.02.2018 18:00 - 19:00 | 0 | 0 | 0 | 0 |
| 22.02.2018 19:00 - 20:00 | 0 | 0 | 0 | 0 |
| 22.02.2018 20:00 - 21:00 | 0 | 0 | 0 | 0 |
| 22.02.2018 21:00 - 22:00 | 0 | 0 | 0 | 0 |
| 22.02.2018 22:00 - 23:00 | 0 | 0 | 0 | 0 |
| 22.02.2018 23:00 - 24:00 | 0 | 0 | 0 | 0 |
| 23.02.2018 00:00 - 01:00 | 0 | 0 | 0 | 0 |
| 23.02.2018 01:00 - 02:00 | 0 | 0 | 0 | 0 |
| 23.02.2018 02:00 - 03:00 | 0 | 0 | 0 | 0 |
| 23.02.2018 03:00 - 04:00 | 0 | 0 | 0 | 0 |
| 23.02.2018 04:00 - 05:00 | 0 | 0 | 0 | 0 |
| 23.02.2018 05:00 - 06:00 | 0 | 0 | 0 | 0 |
| 23.02.2018 06:00 - 07:00 | 0 | 0 | 0 | 0 |
| 23.02.2018 07:00 - 08:00 | 0 | 0 | 0 | 0 |
| 23.02.2018 08:00 - 09:00 | 0 | 0 | 0 | 0 |
| 23.02.2018 09:00 - 10:00 | 0 | 0 | 0 | 0 |
| 23.02.2018 10:00 - 11:00 | 0 | 0 | 0 | 0 |
| 23.02.2018 11:00 - 12:00 | 0 | 0 | 0 | 0 |
| 23.02.2018 12:00 - 13:00 | 0 | 0 | 0 | 0 |
| 23.02.2018 13:00 - 14:00 | 0 | 0 | 0 | 0 |
| 23.02.2018 14:00 - 15:00 | 0 | 0 | 0 | 0 |
| 23.02.2018 15:00 - 16:00 | 0 | 0 | 0 | 0 |
| 23.02.2018 16:00 - 17:00 | 0 | 0 | 0 | 0 |
| 23.02.2018 17:00 - 18:00 | 0 | 0 | 0 | 0 |
| 23.02.2018 18:00 - 19:00 | 0 | 0 | 0 | 0 |
| 23.02.2018 19:00 - 20:00 | 0 | 0 | 0 | 0 |
| 23.02.2018 20:00 - 21:00 | 0 | 0 | 0 | 0 |
| 23.02.2018 21:00 - 22:00 | 0 | 0 | 0 | 0 |
| 23.02.2018 22:00 - 23:00 | 0 | 0 | 0 | 0 |
| 23.02.2018 23:00 - 24:00 | 0 | 0 | 0 | 0 |
| 24.02.2018 00:00 - 01:00 | 0 | 0 | 0 | 0 |
| 24.02.2018 01:00 - 02:00 | 0 | 0 | 0 | 0 |
| 24.02.2018 02:00 - 03:00 | 0 | 0 | 0 | 0 |
| 24.02.2018 03:00 - 04:00 | 0 | 0 | 0 | 0 |
| 24.02.2018 04:00 - 05:00 | 0 | 0 | 0 | 0 |
| 24.02.2018 05:00 - 06:00 | 0 | 0 | 0 | 0 |
| 24.02.2018 06:00 - 07:00 | 0 | 0 | 0 | 0 |
| 24.02.2018 07:00 - 08:00 | 0 | 0 | 0 | 0 |
| 24.02.2018 08:00 - 09:00 | 0 | 0 | 0 | 0 |
| 24.02.2018 09:00 - 10:00 | 0 | 0 | 0 | 0 |
| 24.02.2018 10:00 - 11:00 | 0 | 0 | 0 | 0 |
| 24.02.2018 11:00 - 12:00 | 0 | 0 | 0 | 0 |
| 24.02.2018 12:00 - 13:00 | 0 | 0 | 0 | 0 |
| 24.02.2018 13:00 - 14:00 | 0 | 0 | 0 | 0 |
| 24.02.2018 14:00 - 15:00 | 0 | 0 | 0 | 0 |
| 24.02.2018 15:00 - 16:00 | 0 | 0 | 0 | 0 |
| 24.02.2018 16:00 - 17:00 | 0 | 0 | 0 | 0 |
| 24.02.2018 17:00 - 18:00 | 0 | 0 | 0 | 0 |
| 24.02.2018 18:00 - 19:00 | 0 | 0 | 0 | 0 |
| 24.02.2018 19:00 - 20:00 | 0 | 0 | 0 | 0 |
| 24.02.2018 20:00 - 21:00 | 0 | 0 | 0 | 0 |
| 24.02.2018 21:00 - 22:00 | 0 | 0 | 0 | 0 |
| 24.02.2018 22:00 - 23:00 | 0 | 0 | 0 | 0 |
| 24.02.2018 23:00 - 24:00 | 0 | 0 | 0 | 0 |
| 25.02.2018 00:00 - 01:00 | 0 | 0 | 0 | 0 |
| 25.02.2018 01:00 - 02:00 | 0 | 0 | 0 | 0 |
| 25.02.2018 02:00 - 03:00 | 0 | 0 | 0 | 0 |
| 25.02.2018 03:00 - 04:00 | 0 | 0 | 0 | 0 |
| 25.02.2018 04:00 - 05:00 | 0 | 0 | 0 | 0 |
| 25.02.2018 05:00 - 06:00 | 0 | 0 | 0 | 0 |
| 25.02.2018 06:00 - 07:00 | 0 | 0 | 0 | 0 |
| 25.02.2018 07:00 - 08:00 | 0 | 0 | 0 | 0 |
| 25.02.2018 08:00 - 09:00 | 0 | 0 | 0 | 0 |
| 25.02.2018 09:00 - 10:00 | 0 | 0 | 0 | 0 |
| 25.02.2018 10:00 - 11:00 | 0 | 0 | 0 | 0 |
| 25.02.2018 11:00 - 12:00 | 0 | 0 | 0 | 0 |
| 25.02.2018 12:00 - 13:00 | 0 | 0 | 0 | 0 |
| 25.02.2018 13:00 - 14:00 | 0 | 0 | 0 | 0 |
| 25.02.2018 14:00 - 15:00 | 0 | 0 | 0 | 0 |
| 25.02.2018 15:00 - 16:00 | 0 | 0 | 0 | 0 |
| 25.02.2018 16:00 - 17:00 | 0 | 0 | 0 | 0 |
| 25.02.2018 17:00 - 18:00 | 0 | 0 | 0 | 0 |
| 25.02.2018 18:00 - 19:00 | 0 | 0 | 0 | 0 |
| 25.02.2018 19:00 - 20:00 | 0 | 0 | 0 | 0 |
| 25.02.2018 20:00 - 21:00 | 0 | 0 | 0 | 0 |
| 25.02.2018 21:00 - 22:00 | 0 | 0 | 0 | 0 |
| 25.02.2018 22:00 - 23:00 | 630 | 0 | 0 | 0 |
| 25.02.2018 23:00 - 24:00 | 630 | 0 | 0 | 0 |
| 26.02.2018 00:00 - 01:00 | 630 | 0 | 0 | 0 |
| 26.02.2018 01:00 - 02:00 | 1230 | 0 | 0 | 0 |
| 26.02.2018 02:00 - 03:00 | 1530 | 0 | 0 | 0 |
| 26.02.2018 03:00 - 04:00 | 1530 | 0 | 0 | 0 |
| 26.02.2018 04:00 - 05:00 | 1530 | 0 | 0 | 0 |
| 26.02.2018 05:00 - 06:00 | 1530 | 0 | 0 | 0 |
| 26.02.2018 06:00 - 07:00 | 0 | 0 | 0 | 0 |
| 26.02.2018 07:00 - 08:00 | 0 | 0 | 0 | 0 |
| 26.02.2018 08:00 - 09:00 | 0 | 0 | 0 | 0 |
| 26.02.2018 09:00 - 10:00 | 0 | 0 | 0 | 0 |
| 26.02.2018 10:00 - 11:00 | 0 | 0 | 0 | 0 |
| 26.02.2018 11:00 - 12:00 | 0 | 0 | 0 | 0 |
| 26.02.2018 12:00 - 13:00 | 500 | 0 | 0 | 0 |
| 26.02.2018 13:00 - 14:00 | 500 | 0 | 0 | 0 |
| 26.02.2018 14:00 - 15:00 | 800 | 0 | 0 | 0 |
| 26.02.2018 15:00 - 16:00 | 800 | 0 | 0 | 0 |
| 26.02.2018 16:00 - 17:00 | 800 | 0 | 0 | 0 |
| 26.02.2018 17:00 - 18:00 | 800 | 0 | 0 | 0 |
| 26.02.2018 18:00 - 19:00 | 800 | 0 | 0 | 0 |
| 26.02.2018 19:00 - 20:00 | 800 | 0 | 0 | 0 |
| 26.02.2018 20:00 - 21:00 | 800 | 0 | 0 | 0 |
| 26.02.2018 21:00 - 22:00 | 1020 | 0 | 0 | 0 |
| 26.02.2018 22:00 - 23:00 | 1115 | 0 | 0 | 0 |
| 26.02.2018 23:00 - 24:00 | 1115 | 0 | 0 | 0 |
| 27.02.2018 00:00 - 01:00 | 1315 | 0 | 0 | 0 |
| 27.02.2018 01:00 - 02:00 | 1315 | 0 | 0 | 0 |
| 27.02.2018 02:00 - 03:00 | 1355 | 0 | 0 | 0 |
| 27.02.2018 03:00 - 04:00 | 1755 | 0 | 0 | 0 |
| 27.02.2018 04:00 - 05:00 | 1755 | 0 | 0 | 0 |
| 27.02.2018 05:00 - 06:00 | 1755 | 0 | 0 | 0 |
| 27.02.2018 06:00 - 07:00 | 0 | 0 | 0 | 0 |
| 27.02.2018 07:00 - 08:00 | 0 | 0 | 0 | 0 |
| 27.02.2018 08:00 - 09:00 | 0 | 0 | 0 | 0 |
| 27.02.2018 09:00 - 10:00 | 0 | 0 | 0 | 0 |
| 27.02.2018 10:00 - 11:00 | 0 | 0 | 0 | 0 |
| 27.02.2018 11:00 - 12:00 | 0 | 0 | 0 | 0 |
| 27.02.2018 12:00 - 13:00 | 0 | 0 | 0 | 0 |
| 27.02.2018 13:00 - 14:00 | 0 | 0 | 0 | 0 |
| 27.02.2018 14:00 - 15:00 | 0 | 0 | 0 | 0 |
| 27.02.2018 15:00 - 16:00 | 0 | 0 | 0 | 0 |
| 27.02.2018 16:00 - 17:00 | 500 | 0 | 0 | 0 |
| 27.02.2018 17:00 - 18:00 | 500 | 0 | 0 | 0 |
| 27.02.2018 18:00 - 19:00 | 500 | 0 | 0 | 0 |
| 27.02.2018 19:00 - 20:00 | 1200 | 0 | 0 | 0 |
| 27.02.2018 20:00 - 21:00 | 1200 | 0 | 0 | 0 |
| 27.02.2018 21:00 - 22:00 | 1700 | 0 | 0 | 0 |
| 27.02.2018 22:00 - 23:00 | 1900 | 0 | 0 | 0 |
| 27.02.2018 23:00 - 24:00 | 1900 | 0 | 0 | 0 |
| 28.02.2018 00:00 - 01:00 | 1900 | 0 | 0 | 0 |
| 28.02.2018 01:00 - 02:00 | 1900 | 0 | 0 | 0 |
| 28.02.2018 02:00 - 03:00 | 1910 | 0 | 0 | 0 |
| 28.02.2018 03:00 - 04:00 | 2530 | 0 | 0 | 0 |
| 28.02.2018 04:00 - 05:00 | 2740 | 0 | 0 | 0 |
| 28.02.2018 05:00 - 06:00 | 2740 | 0 | 0 | 0 |
| 28.02.2018 06:00 - 07:00 | 740 | 0 | 0 | 0 |
| 28.02.2018 07:00 - 08:00 | 740 | 0 | 0 | 0 |
| 28.02.2018 08:00 - 09:00 | 740 | 0 | 0 | 0 |
| 28.02.2018 09:00 - 10:00 | 740 | 0 | 0 | 0 |
| 28.02.2018 10:00 - 11:00 | 740 | 0 | 0 | 0 |
| 28.02.2018 11:00 - 12:00 | 740 | 0 | 0 | 0 |
| 28.02.2018 12:00 - 13:00 | 740 | 0 | 0 | 0 |
| 28.02.2018 13:00 - 14:00 | 740 | 0 | 0 | 0 |
| 28.02.2018 14:00 - 15:00 | 740 | 0 | 0 | 0 |
| 28.02.2018 15:00 - 16:00 | 740 | 0 | 0 | 0 |
| 28.02.2018 16:00 - 17:00 | 740 | 0 | 0 | 0 |
| 28.02.2018 17:00 - 18:00 | 740 | 0 | 0 | 0 |
| 28.02.2018 18:00 - 19:00 | 740 | 0 | 0 | 0 |
| 28.02.2018 19:00 - 20:00 | 740 | 0 | 0 | 0 |
| 28.02.2018 20:00 - 21:00 | 740 | 0 | 0 | 0 |
| 28.02.2018 21:00 - 22:00 | 740 | 0 | 0 | 0 |
| 28.02.2018 22:00 - 23:00 | 740 | 0 | 0 | 0 |
| 28.02.2018 23:00 - 24:00 | 740 | 0 | 0 | 0 |
| 01.03.2018 00:00 - 01:00 | 740 | 0 | 0 | 0 |
| 01.03.2018 01:00 - 02:00 | 740 | 0 | 0 | 0 |
| 01.03.2018 02:00 - 03:00 | 740 | 0 | 0 | 0 |
| 01.03.2018 03:00 - 04:00 | 740 | 0 | 0 | 0 |
| 01.03.2018 04:00 - 05:00 | 740 | 0 | 0 | 0 |
| 01.03.2018 05:00 - 06:00 | 740 | 0 | 0 | 0 |